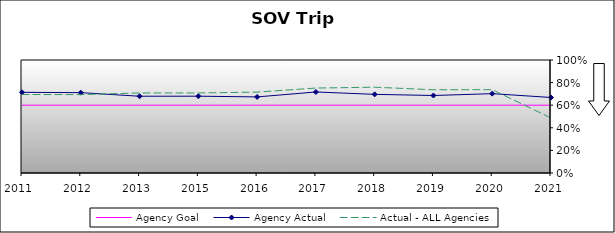
| Category | Agency Goal | Agency Actual | Actual - ALL Agencies |
|---|---|---|---|
| 2011.0 | 0.6 | 0.714 | 0.695 |
| 2012.0 | 0.6 | 0.711 | 0.694 |
| 2013.0 | 0.6 | 0.679 | 0.708 |
| 2015.0 | 0.6 | 0.68 | 0.708 |
| 2016.0 | 0.6 | 0.673 | 0.716 |
| 2017.0 | 0.6 | 0.717 | 0.752 |
| 2018.0 | 0.6 | 0.696 | 0.759 |
| 2019.0 | 0.6 | 0.686 | 0.736 |
| 2020.0 | 0.6 | 0.702 | 0.737 |
| 2021.0 | 0.6 | 0.668 | 0.487 |